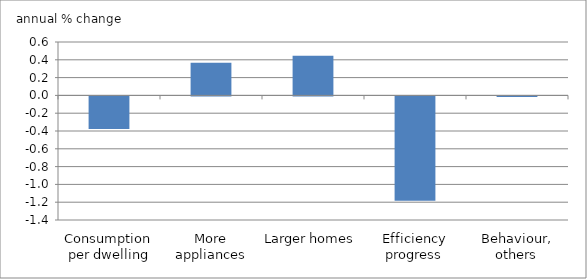
| Category | 1990-2008 |
|---|---|
| Consumption per dwelling | -0.366 |
| More appliances | 0.368 |
| Larger homes | 0.446 |
| Efficiency progress | -1.173 |
| Behaviour, others | -0.007 |